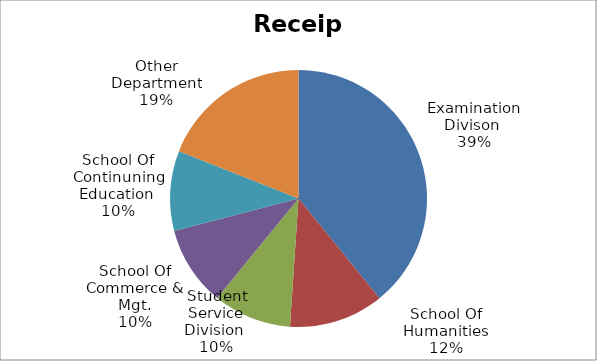
| Category | Total | Percentage |
|---|---|---|
| 0 | 536370000 | 39.15 |
| 1 | 163140000 | 12 |
| 2 | 134910000 | 10 |
| 3 | 137450000 | 10 |
| 4 | 137760000 | 10 |
| 5 | 260450000 | 19 |